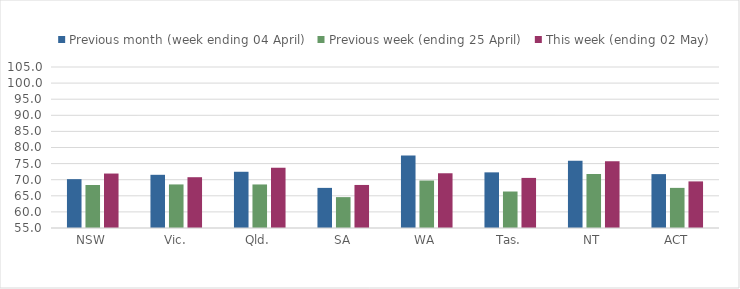
| Category | Previous month (week ending 04 April) | Previous week (ending 25 April) | This week (ending 02 May) |
|---|---|---|---|
| NSW | 70.172 | 68.354 | 71.913 |
| Vic. | 71.52 | 68.532 | 70.774 |
| Qld. | 72.462 | 68.523 | 73.714 |
| SA | 67.459 | 64.588 | 68.369 |
| WA | 77.52 | 69.744 | 71.998 |
| Tas. | 72.281 | 66.333 | 70.557 |
| NT | 75.904 | 71.771 | 75.74 |
| ACT | 71.734 | 67.461 | 69.47 |